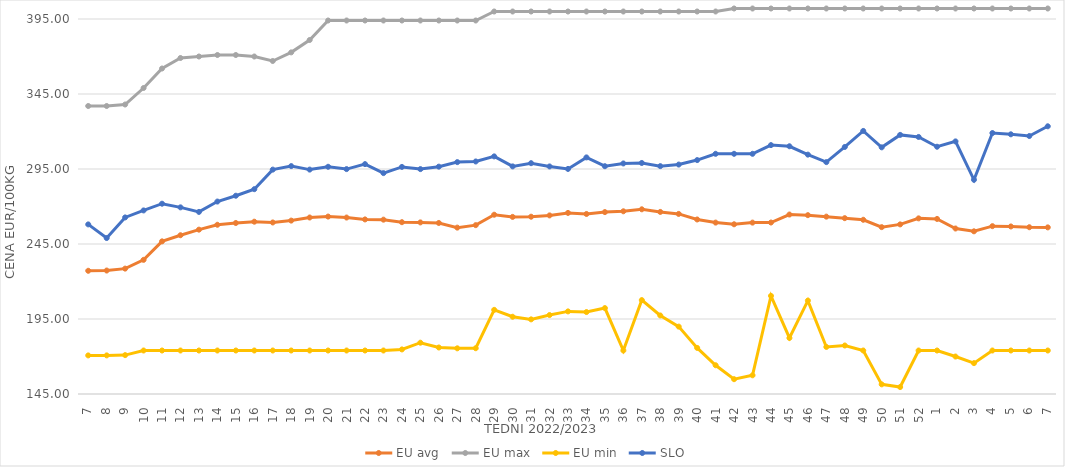
| Category | EU avg | EU max | EU min | SLO |
|---|---|---|---|---|
| 7.0 | 227.145 | 337 | 170.719 | 258.07 |
| 8.0 | 227.312 | 337 | 170.743 | 248.97 |
| 9.0 | 228.588 | 338 | 170.92 | 262.72 |
| 10.0 | 234.434 | 349 | 174 | 267.38 |
| 11.0 | 246.762 | 362 | 174 | 271.86 |
| 12.0 | 250.845 | 369 | 174 | 269.43 |
| 13.0 | 254.568 | 370 | 174 | 266.39 |
| 14.0 | 257.819 | 371 | 174 | 273.3 |
| 15.0 | 259 | 371 | 174 | 277.18 |
| 16.0 | 259.873 | 370 | 174 | 281.55 |
| 17.0 | 259.351 | 367 | 174 | 294.59 |
| 18.0 | 260.6 | 372.758 | 174 | 296.93 |
| 19.0 | 262.669 | 381 | 174 | 294.6 |
| 20.0 | 263.291 | 394 | 174 | 296.48 |
| 21.0 | 262.64 | 394 | 174 | 294.94 |
| 22.0 | 261.388 | 394 | 174 | 298.26 |
| 23.0 | 261.228 | 394 | 174 | 292.27 |
| 24.0 | 259.544 | 394 | 174.72 | 296.39 |
| 25.0 | 259.395 | 394 | 179.2 | 294.93 |
| 26.0 | 259.018 | 394 | 176 | 296.56 |
| 27.0 | 255.922 | 394 | 175.451 | 299.59 |
| 28.0 | 257.564 | 394 | 175.52 | 300.01 |
| 29.0 | 264.52 | 400 | 201.097 | 303.41 |
| 30.0 | 263.067 | 400 | 196.496 | 296.73 |
| 31.0 | 263.196 | 400 | 194.756 | 298.88 |
| 32.0 | 264.059 | 400 | 197.634 | 296.7 |
| 33.0 | 265.729 | 400 | 200.07 | 295.05 |
| 34.0 | 265.016 | 400 | 199.637 | 302.73 |
| 35.0 | 266.273 | 400 | 202.277 | 296.86 |
| 36.0 | 266.807 | 400 | 174 | 298.7 |
| 37.0 | 268.136 | 400 | 207.594 | 299.02 |
| 38.0 | 266.39 | 400 | 197.352 | 296.91 |
| 39.0 | 265.059 | 400 | 189.926 | 297.96 |
| 40.0 | 261.35 | 400 | 175.723 | 300.95 |
| 41.0 | 259.271 | 400 | 164.165 | 305.13 |
| 42.0 | 258.146 | 402 | 154.869 | 305.13 |
| 43.0 | 259.256 | 402 | 157.459 | 305.13 |
| 44.0 | 259.32 | 402 | 210.415 | 310.93 |
| 45.0 | 264.649 | 402 | 182.35 | 310.16 |
| 46.0 | 264.228 | 402 | 207.247 | 304.58 |
| 47.0 | 263.24 | 402 | 176.378 | 299.59 |
| 48.0 | 262.225 | 402 | 177.332 | 309.69 |
| 49.0 | 261.152 | 402 | 174 | 320.38 |
| 50.0 | 256.24 | 402 | 151.434 | 309.44 |
| 51.0 | 258.071 | 402 | 149.638 | 317.74 |
| 52.0 | 262.088 | 402 | 174 | 316.36 |
| 1.0 | 261.716 | 402 | 174 | 309.84 |
| 2.0 | 255.331 | 402 | 169.983 | 313.4 |
| 3.0 | 253.46 | 402 | 165.574 | 287.81 |
| 4.0 | 256.897 | 402 | 174 | 318.98 |
| 5.0 | 256.686 | 402 | 174 | 318.13 |
| 6.0 | 256.184 | 402 | 174 | 316.99 |
| 7.0 | 256.082 | 402 | 174 | 323.47 |